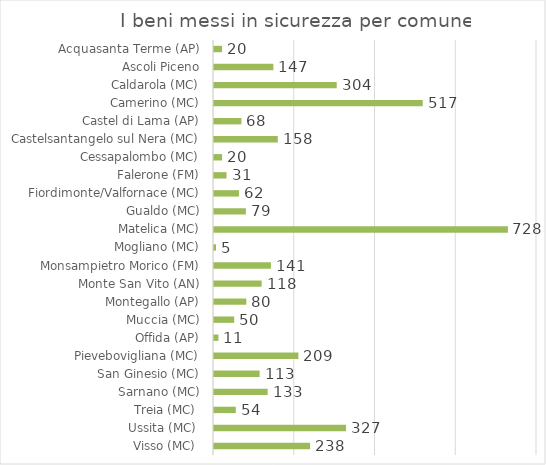
| Category | Series 0 |
|---|---|
| Visso (MC)  | 238 |
| Ussita (MC)  | 327 |
| Treia (MC)  | 54 |
| Sarnano (MC) | 133 |
| San Ginesio (MC) | 113 |
| Pievebovigliana (MC) | 209 |
| Offida (AP) | 11 |
| Muccia (MC) | 50 |
| Montegallo (AP) | 80 |
| Monte San Vito (AN) | 118 |
| Monsampietro Morico (FM) | 141 |
| Mogliano (MC) | 5 |
| Matelica (MC) | 728 |
| Gualdo (MC) | 79 |
| Fiordimonte/Valfornace (MC) | 62 |
| Falerone (FM) | 31 |
| Cessapalombo (MC) | 20 |
| Castelsantangelo sul Nera (MC) | 158 |
| Castel di Lama (AP) | 68 |
| Camerino (MC) | 517 |
| Caldarola (MC) | 304 |
| Ascoli Piceno | 147 |
| Acquasanta Terme (AP) | 20 |